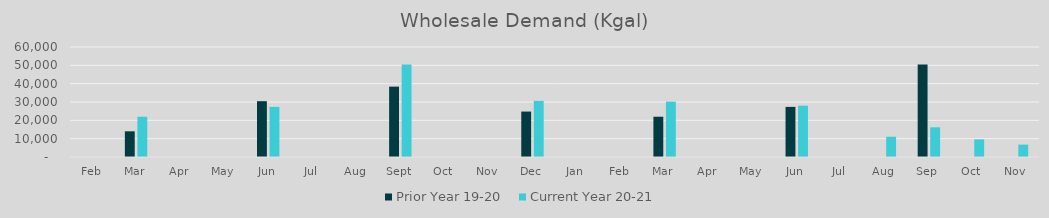
| Category | Prior Year 19-20  | Current Year 20-21 |
|---|---|---|
| Feb | 0 | 0 |
| Mar | 14013.78 | 21965.02 |
| Apr | 0 | 0 |
| May | 0 | 0 |
| Jun | 30443.6 | 27331 |
| Jul | 0 | 0 |
| Aug | 0 | 0 |
| Sep | 38376.14 | 50400.24 |
| Oct | 0 | 0 |
| Nov | 0 | 0 |
| Dec | 24784.98 | 30611.9 |
| Jan | 0 | 0 |
| Feb | 0 | 0 |
| Mar | 21965.02 | 30196.76 |
| Apr | 0 | 0 |
| May | 0 | 0 |
| Jun | 27331 | 27993.9 |
| Jul | 0 | 0 |
| Aug | 0 | 11056.179 |
| Sep | 50400.24 | 16202.763 |
| Oct | 0 | 9585.62 |
| Nov | 0 | 6754.44 |